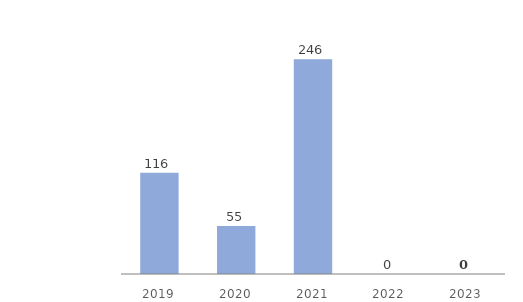
| Category | Assets in Kazakhstan |
|---|---|
| 2019.0 | 116 |
| 2020.0 | 55 |
| 2021.0 | 246 |
| 2022.0 | 0 |
| 2023.0 | 0 |